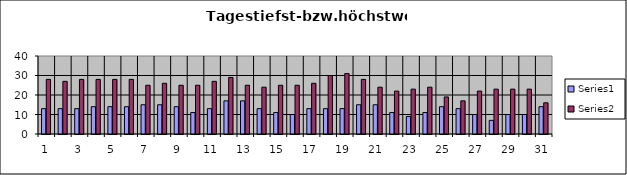
| Category | Series 0 | Series 1 |
|---|---|---|
| 0 | 13 | 28 |
| 1 | 13 | 27 |
| 2 | 13 | 28 |
| 3 | 14 | 28 |
| 4 | 14 | 28 |
| 5 | 14 | 28 |
| 6 | 15 | 25 |
| 7 | 15 | 26 |
| 8 | 14 | 25 |
| 9 | 11 | 25 |
| 10 | 13 | 27 |
| 11 | 17 | 29 |
| 12 | 17 | 25 |
| 13 | 13 | 24 |
| 14 | 11 | 25 |
| 15 | 10 | 25 |
| 16 | 13 | 26 |
| 17 | 13 | 30 |
| 18 | 13 | 31 |
| 19 | 15 | 28 |
| 20 | 15 | 24 |
| 21 | 11 | 22 |
| 22 | 9 | 23 |
| 23 | 11 | 24 |
| 24 | 14 | 19 |
| 25 | 13 | 17 |
| 26 | 10 | 22 |
| 27 | 7 | 23 |
| 28 | 10 | 23 |
| 29 | 10 | 23 |
| 30 | 14 | 16 |